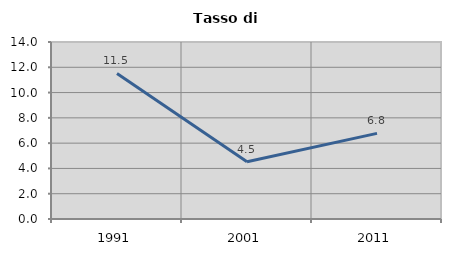
| Category | Tasso di disoccupazione   |
|---|---|
| 1991.0 | 11.516 |
| 2001.0 | 4.527 |
| 2011.0 | 6.771 |